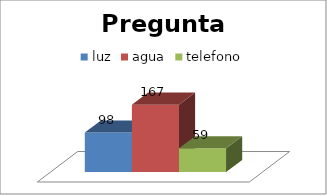
| Category | luz | agua | telefono |
|---|---|---|---|
| 0 | 98 | 167 | 59 |